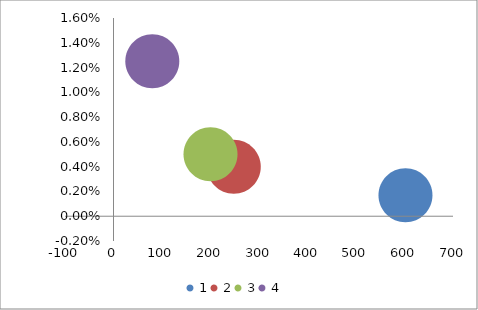
| Category | Series 0 |
|---|---|
| 602.0 | 0.002 |
| 248.0 | 0.004 |
| 200.0 | 0.005 |
| 80.0 | 0.012 |